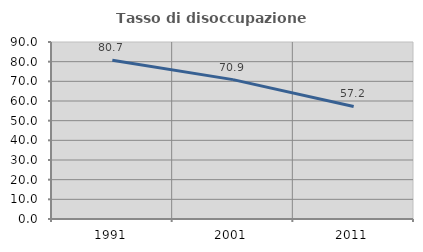
| Category | Tasso di disoccupazione giovanile  |
|---|---|
| 1991.0 | 80.717 |
| 2001.0 | 70.875 |
| 2011.0 | 57.239 |